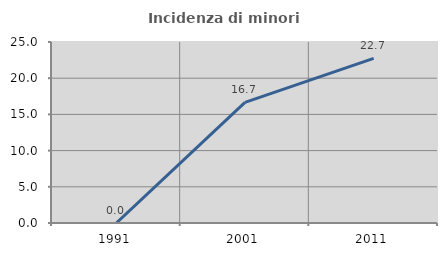
| Category | Incidenza di minori stranieri |
|---|---|
| 1991.0 | 0 |
| 2001.0 | 16.667 |
| 2011.0 | 22.727 |